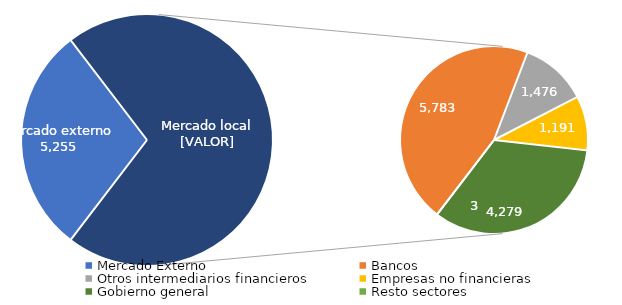
| Category | Series 0 |
|---|---|
| Mercado Externo | 5254.771 |
| Bancos | 5783.345 |
| Otros intermediarios financieros | 1476.499 |
| Empresas no financieras | 1191.184 |
| Gobierno general | 4278.922 |
| Resto sectores | 3.133 |